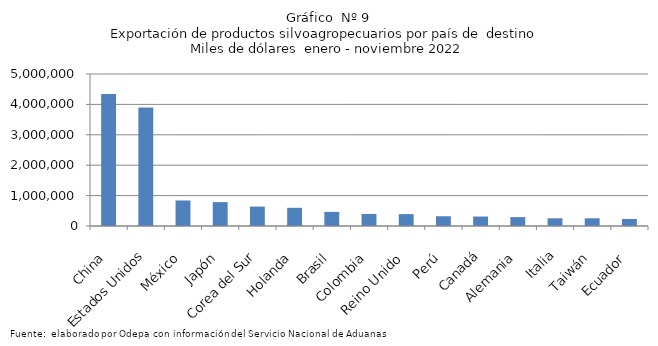
| Category | Series 0 |
|---|---|
| China | 4346051.213 |
| Estados Unidos | 3897720.175 |
| México | 839425.173 |
| Japón | 785636.33 |
| Corea del Sur | 638420.206 |
| Holanda | 598413.026 |
| Brasil | 463348.517 |
| Colombia | 396518.508 |
| Reino Unido | 391136.43 |
| Perú | 320852.777 |
| Canadá | 311776.74 |
| Alemania | 293053.44 |
| Italia | 253313.299 |
| Taiwán | 252614.724 |
| Ecuador | 231670.408 |